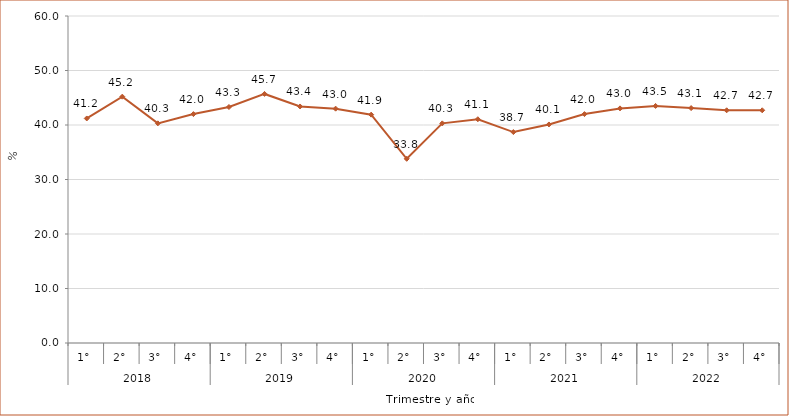
| Category | Series 0 |
|---|---|
| 0 | 41.2 |
| 1 | 45.2 |
| 2 | 40.3 |
| 3 | 42 |
| 4 | 43.3 |
| 5 | 45.7 |
| 6 | 43.4 |
| 7 | 43 |
| 8 | 41.9 |
| 9 | 33.8 |
| 10 | 40.3 |
| 11 | 41.056 |
| 12 | 38.7 |
| 13 | 40.1 |
| 14 | 42 |
| 15 | 43.048 |
| 16 | 43.5 |
| 17 | 43.1 |
| 18 | 42.7 |
| 19 | 42.7 |